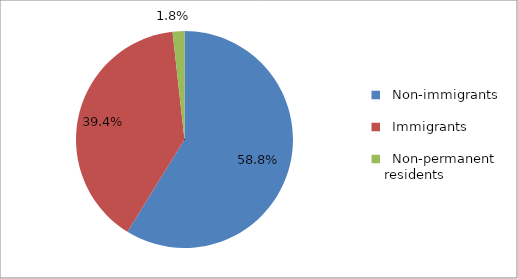
| Category | Series 0 |
|---|---|
|   Non-immigrants | 28430 |
|   Immigrants | 19065 |
|   Non-permanent residents | 850 |